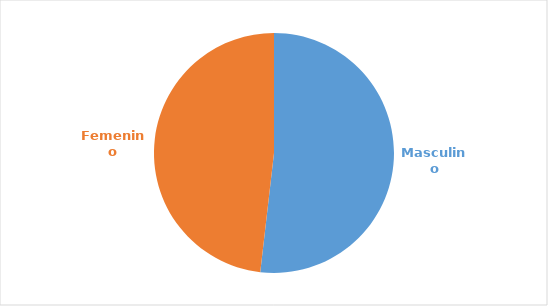
| Category | Series 0 |
|---|---|
| Masculino | 0.518 |
| Femenino | 0.482 |